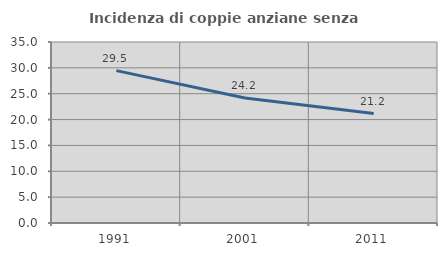
| Category | Incidenza di coppie anziane senza figli  |
|---|---|
| 1991.0 | 29.467 |
| 2001.0 | 24.176 |
| 2011.0 | 21.162 |